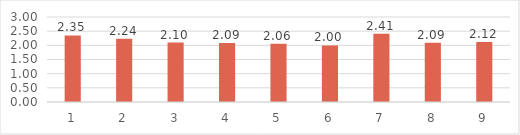
| Category | Series 0 |
|---|---|
| 0 | 2.35 |
| 1 | 2.235 |
| 2 | 2.1 |
| 3 | 2.085 |
| 4 | 2.06 |
| 5 | 1.995 |
| 6 | 2.41 |
| 7 | 2.09 |
| 8 | 2.12 |